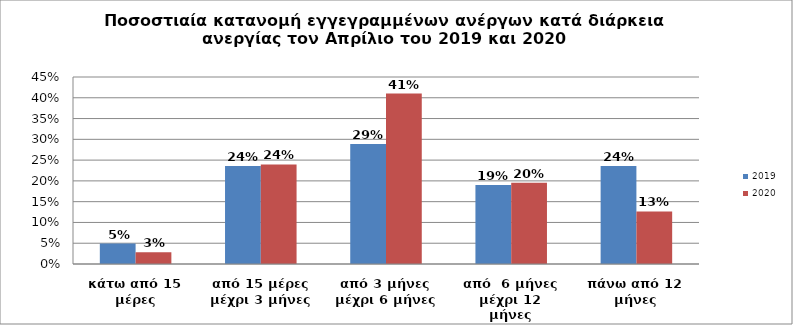
| Category | 2019 | 2020 |
|---|---|---|
| κάτω από 15 μέρες | 0.049 | 0.028 |
| από 15 μέρες μέχρι 3 μήνες | 0.236 | 0.24 |
| από 3 μήνες μέχρι 6 μήνες | 0.289 | 0.41 |
| από  6 μήνες μέχρι 12 μήνες | 0.19 | 0.195 |
| πάνω από 12 μήνες | 0.236 | 0.126 |